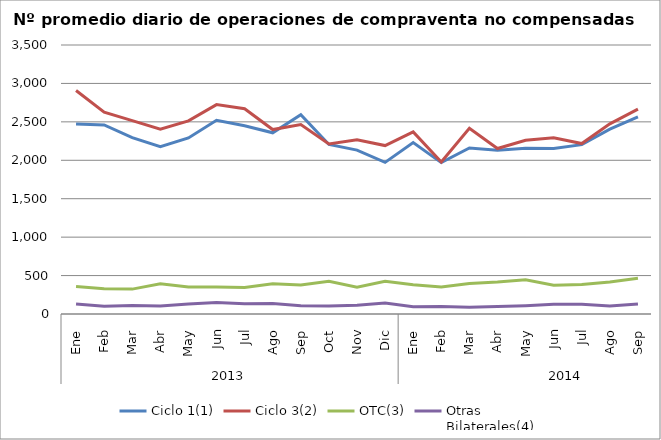
| Category | Ciclo 1(1) | Ciclo 3(2) | OTC(3) | Otras
Bilaterales(4) |
|---|---|---|---|---|
| 0 | 2472.091 | 2907.273 | 357.864 | 131.409 |
| 1 | 2459.8 | 2626.25 | 327.5 | 100.6 |
| 2 | 2294.6 | 2516 | 323.75 | 111.65 |
| 3 | 2176.182 | 2403.364 | 394.818 | 103.364 |
| 4 | 2290.048 | 2512.714 | 352.095 | 130.143 |
| 5 | 2520.75 | 2724.25 | 349.7 | 151.05 |
| 6 | 2449.045 | 2670.182 | 344.818 | 134.5 |
| 7 | 2357.333 | 2400.048 | 392.524 | 137.571 |
| 8 | 2593.778 | 2465 | 376.889 | 108.389 |
| 9 | 2205.955 | 2213.318 | 425.318 | 105.636 |
| 10 | 2132.1 | 2268.1 | 350 | 113.75 |
| 11 | 1972.35 | 2191.55 | 424.35 | 141.55 |
| 12 | 2231.227 | 2368.955 | 379.864 | 95 |
| 13 | 1969.85 | 1978.25 | 352.25 | 97.9 |
| 14 | 2160.619 | 2415.286 | 395.857 | 87.762 |
| 15 | 2130.667 | 2153.048 | 416.143 | 96 |
| 16 | 2155.9 | 2259.8 | 444.8 | 108.2 |
| 17 | 2153.571 | 2294.381 | 375.286 | 126.095 |
| 18 | 2203.545 | 2217.727 | 382.409 | 125.409 |
| 19 | 2404.35 | 2474.4 | 416.2 | 102.85 |
| 20 | 2565.8 | 2666.55 | 463.9 | 128.9 |